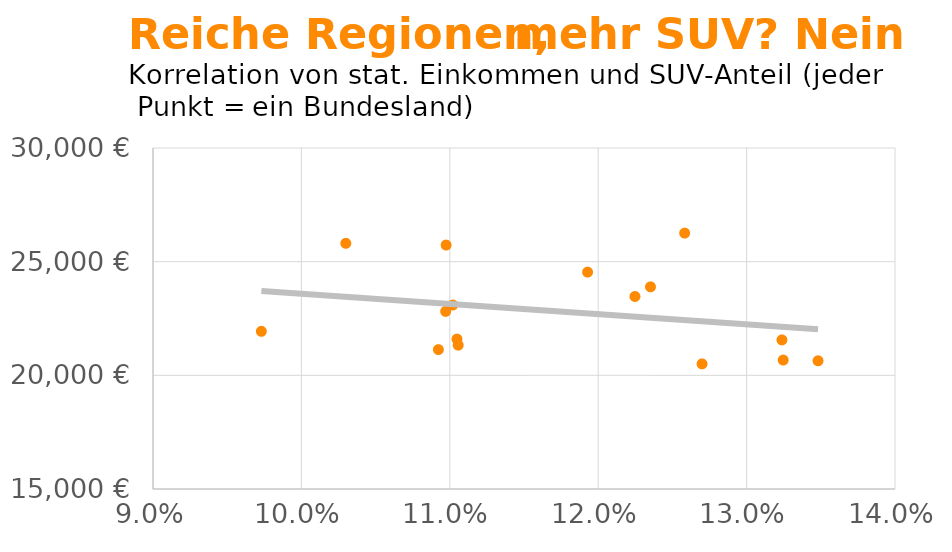
| Category | Series 0 |
|---|---|
| 0.1105653912050257 | 21327 |
| 0.10299234516353514 | 25808 |
| 0.0973017170891251 | 21935 |
| 0.11020379011522712 | 23093 |
| 0.11048281861678991 | 21594 |
| 0.10975314030748339 | 25730 |
| 0.1192846849207389 | 24540 |
| 0.10923217550274222 | 21132 |
| 0.12247669050420928 | 23468 |
| 0.1258257678192003 | 26256 |
| 0.12352420306965761 | 23892 |
| 0.109720885466795 | 22812 |
| 0.13481345845731288 | 20640 |
| 0.12699802934092402 | 20504 |
| 0.13238053991626966 | 21558 |
| 0.1324667285670071 | 20671 |